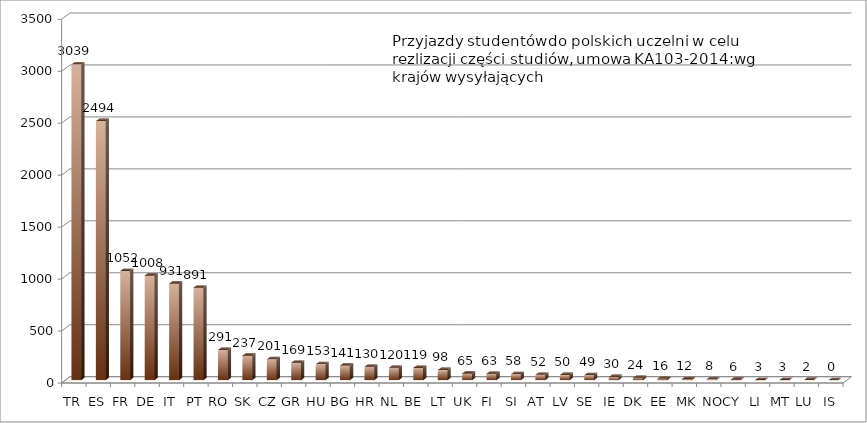
| Category | Series 0 |
|---|---|
| TR | 3039 |
| ES | 2494 |
| FR | 1052 |
| DE | 1008 |
| IT | 931 |
| PT | 891 |
| RO | 291 |
| SK | 237 |
| CZ | 201 |
| GR | 169 |
| HU | 153 |
| BG | 141 |
| HR | 130 |
| NL | 120 |
| BE | 119 |
| LT | 98 |
| UK | 65 |
| FI | 63 |
| SI | 58 |
| AT | 52 |
| LV | 50 |
| SE | 49 |
| IE | 30 |
| DK | 24 |
| EE | 16 |
| MK | 12 |
| NO | 8 |
| CY | 6 |
| LI | 3 |
| MT | 3 |
| LU | 2 |
| IS | 0 |